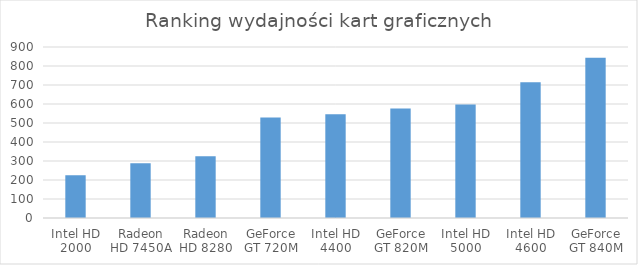
| Category | Punktacja |
|---|---|
| Intel HD 2000 | 225 |
| Radeon HD 7450A | 288 |
| Radeon HD 8280 | 325 |
| GeForce GT 720M | 529 |
| Intel HD 4400 | 546 |
| GeForce GT 820M | 576 |
| Intel HD 5000 | 597 |
| Intel HD 4600 | 715 |
| GeForce GT 840M | 843 |